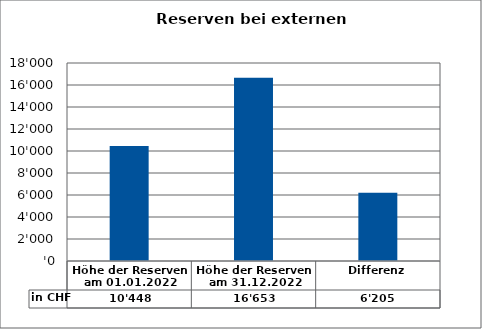
| Category | in CHF |
|---|---|
| Höhe der Reserven am 01.01.2022 | 10448 |
| Höhe der Reserven am 31.12.2022 | 16653 |
| Differenz | 6205 |